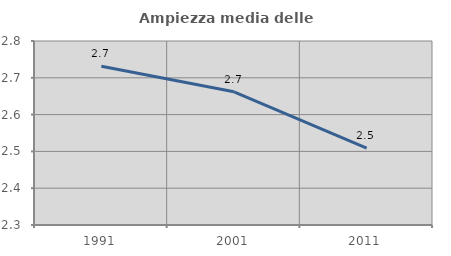
| Category | Ampiezza media delle famiglie |
|---|---|
| 1991.0 | 2.731 |
| 2001.0 | 2.662 |
| 2011.0 | 2.509 |